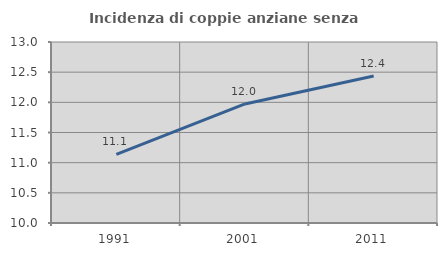
| Category | Incidenza di coppie anziane senza figli  |
|---|---|
| 1991.0 | 11.138 |
| 2001.0 | 11.973 |
| 2011.0 | 12.437 |